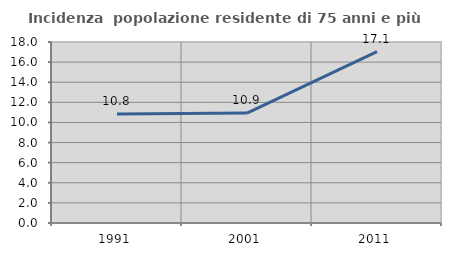
| Category | Incidenza  popolazione residente di 75 anni e più |
|---|---|
| 1991.0 | 10.846 |
| 2001.0 | 10.928 |
| 2011.0 | 17.051 |